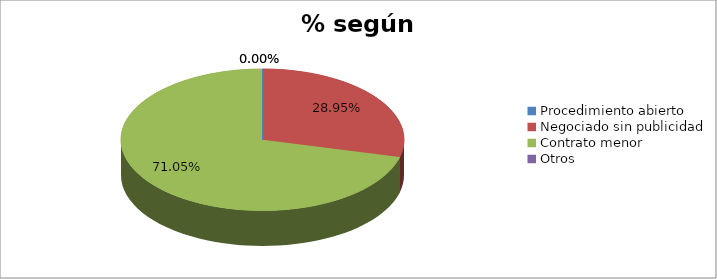
| Category | % según procedimiento |
|---|---|
| Procedimiento abierto | 0 |
| Negociado sin publicidad | 0.29 |
| Contrato menor | 0.71 |
| Otros | 0 |